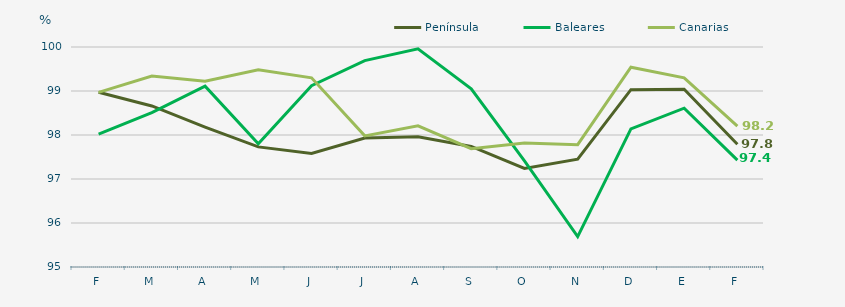
| Category | Península | Baleares | Canarias |
|---|---|---|---|
| F | 98.97 | 98.02 | 98.97 |
| M | 98.66 | 98.51 | 99.34 |
| A | 98.18 | 99.11 | 99.22 |
| M | 97.73 | 97.8 | 99.48 |
| J | 97.58 | 99.12 | 99.3 |
| J | 97.93 | 99.69 | 97.98 |
| A | 97.96 | 99.96 | 98.21 |
| S | 97.74 | 99.05 | 97.69 |
| O | 97.24 | 97.41 | 97.82 |
| N | 97.45 | 95.69 | 97.78 |
| D | 99.03 | 98.14 | 99.54 |
| E | 99.04 | 98.61 | 99.3 |
| F | 97.79 | 97.43 | 98.2 |